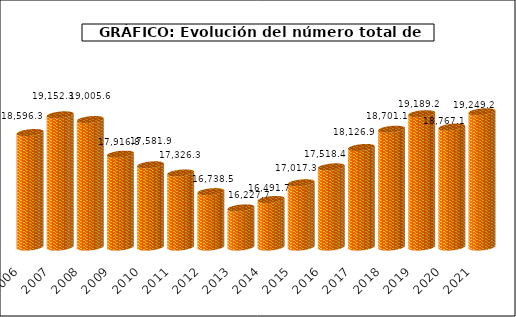
| Category | Series1 |
|---|---|
| 2006.0 | 18596.3 |
| 2007.0 | 19152.3 |
| 2008.0 | 19005.6 |
| 2009.0 | 17916.8 |
| 2010.0 | 17581.9 |
| 2011.0 | 17326.3 |
| 2012.0 | 16738.5 |
| 2013.0 | 16227.7 |
| 2014.0 | 16491.7 |
| 2015.0 | 17017.3 |
| 2016.0 | 17518.4 |
| 2017.0 | 18126.9 |
| 2018.0 | 18701.1 |
| 2019.0 | 19189.213 |
| 2020.0 | 18767.144 |
| 2021.0 | 19249.223 |